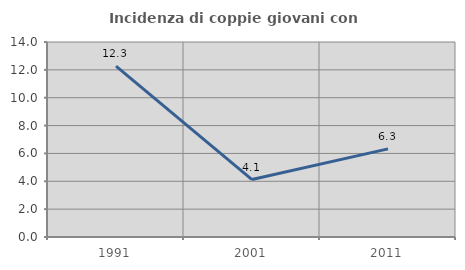
| Category | Incidenza di coppie giovani con figli |
|---|---|
| 1991.0 | 12.264 |
| 2001.0 | 4.124 |
| 2011.0 | 6.329 |